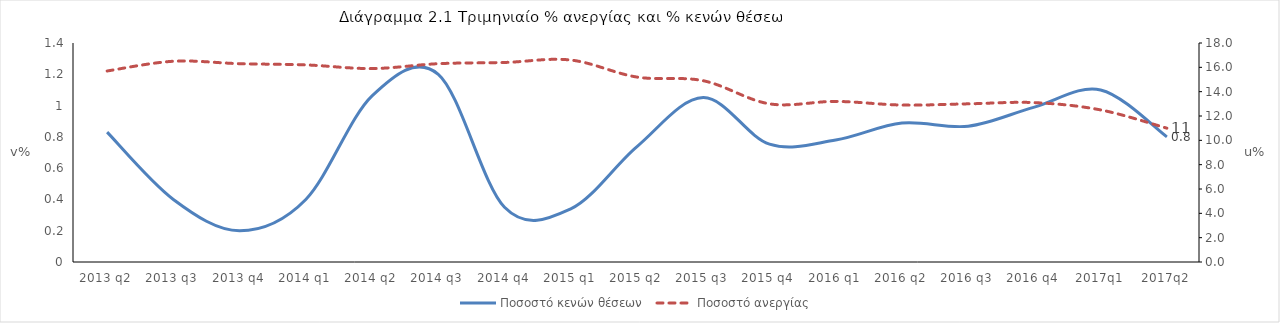
| Category | Ποσοστό κενών θέσεων |
|---|---|
| 2013 q2 | 0.83 |
| 2013 q3 | 0.4 |
| 2013 q4 | 0.2 |
| 2014 q1 | 0.4 |
| 2014 q2 | 1.062 |
| 2014 q3 | 1.2 |
| 2014 q4 | 0.35 |
| 2015 q1 | 0.34 |
| 2015 q2 | 0.738 |
| 2015 q3 | 1.051 |
| 2015 q4 | 0.753 |
| 2016 q1 | 0.78 |
| 2016 q2 | 0.889 |
| 2016 q3 | 0.868 |
| 2016 q4 | 0.99 |
| 2017q1 | 1.1 |
| 2017q2 | 0.8 |